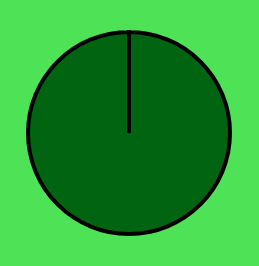
| Category | Series 0 | Series 1 |
|---|---|---|
| 0 | 10 | 10 |
| 1 | 0 | 0 |